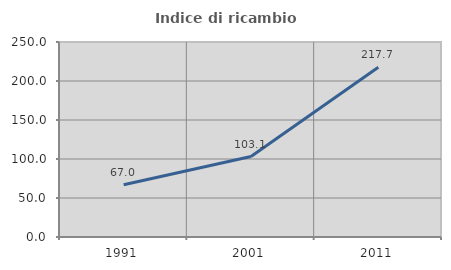
| Category | Indice di ricambio occupazionale  |
|---|---|
| 1991.0 | 67.026 |
| 2001.0 | 103.146 |
| 2011.0 | 217.677 |